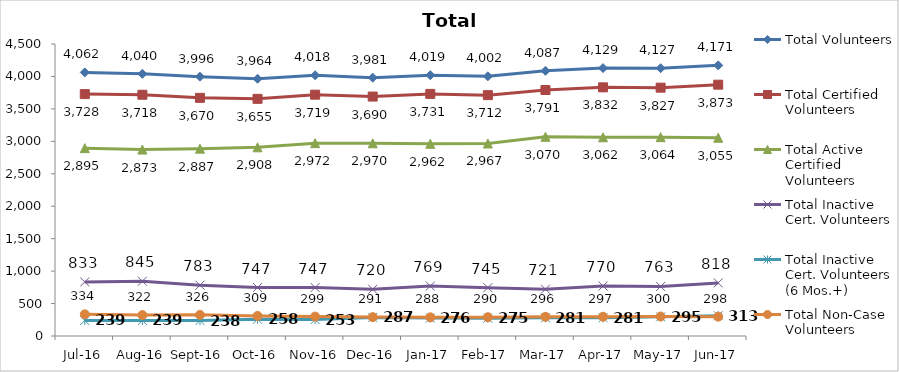
| Category | Total Volunteers | Total Certified Volunteers | Total Active Certified Volunteers | Total Inactive Cert. Volunteers | Total Inactive Cert. Volunteers (6 Mos.+) | Total Non-Case Volunteers |
|---|---|---|---|---|---|---|
| Jul-16 | 4062 | 3728 | 2895 | 833 | 239 | 334 |
| Aug-16 | 4040 | 3718 | 2873 | 845 | 239 | 322 |
| Sep-16 | 3996 | 3670 | 2887 | 783 | 238 | 326 |
| Oct-16 | 3964 | 3655 | 2908 | 747 | 258 | 309 |
| Nov-16 | 4018 | 3719 | 2972 | 747 | 253 | 299 |
| Dec-16 | 3981 | 3690 | 2970 | 720 | 287 | 291 |
| Jan-17 | 4019 | 3731 | 2962 | 769 | 276 | 288 |
| Feb-17 | 4002 | 3712 | 2967 | 745 | 275 | 290 |
| Mar-17 | 4087 | 3791 | 3070 | 721 | 281 | 296 |
| Apr-17 | 4129 | 3832 | 3062 | 770 | 281 | 297 |
| May-17 | 4127 | 3827 | 3064 | 763 | 295 | 300 |
| Jun-17 | 4171 | 3873 | 3055 | 818 | 313 | 298 |